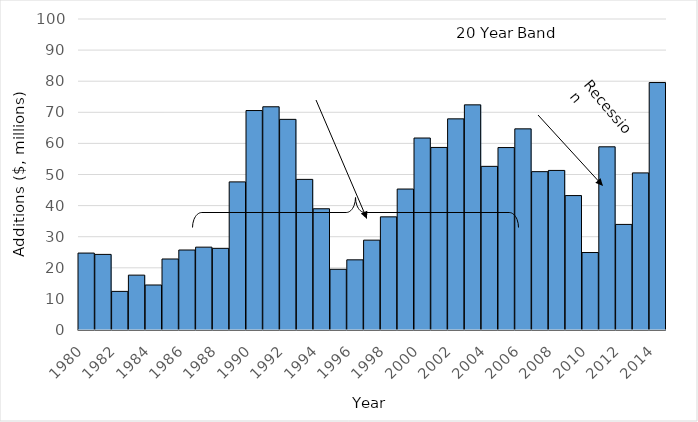
| Category | Additions |
|---|---|
| 1980.0 | 24734563.43 |
| 1981.0 | 24310505.87 |
| 1982.0 | 12414849.37 |
| 1983.0 | 17644455.02 |
| 1984.0 | 14469613.24 |
| 1985.0 | 22831037.72 |
| 1986.0 | 25722891.56 |
| 1987.0 | 26640711.71 |
| 1988.0 | 26256750.93 |
| 1989.0 | 47625301.2 |
| 1990.0 | 70564377.79 |
| 1991.0 | 71776498.1 |
| 1992.0 | 67731482.39 |
| 1993.0 | 48428853.34 |
| 1994.0 | 38982824.12 |
| 1995.0 | 19522851.41 |
| 1996.0 | 22563146.08 |
| 1997.0 | 28891619.07 |
| 1998.0 | 36382670.93 |
| 1999.0 | 45324717.38 |
| 2000.0 | 61727993.19 |
| 2001.0 | 58701328.96 |
| 2002.0 | 67892285.91 |
| 2003.0 | 72393986.62 |
| 2004.0 | 52618722.46 |
| 2005.0 | 58663950.4 |
| 2006.0 | 64680361.54 |
| 2007.0 | 50916533.09 |
| 2008.0 | 51306697.71 |
| 2009.0 | 43227357.52 |
| 2010.0 | 24911726.2 |
| 2011.0 | 58906559.51 |
| 2012.0 | 33948146.39 |
| 2013.0 | 50516038.42 |
| 2014.0 | 79570028.08 |